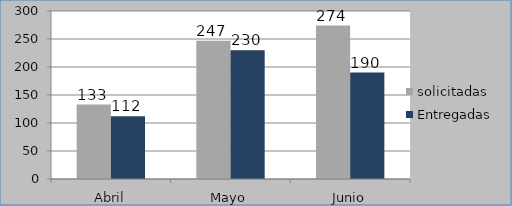
| Category | solicitadas | Entregadas |
|---|---|---|
| Abril | 133 | 112 |
| Mayo | 247 | 230 |
| Junio | 274 | 190 |